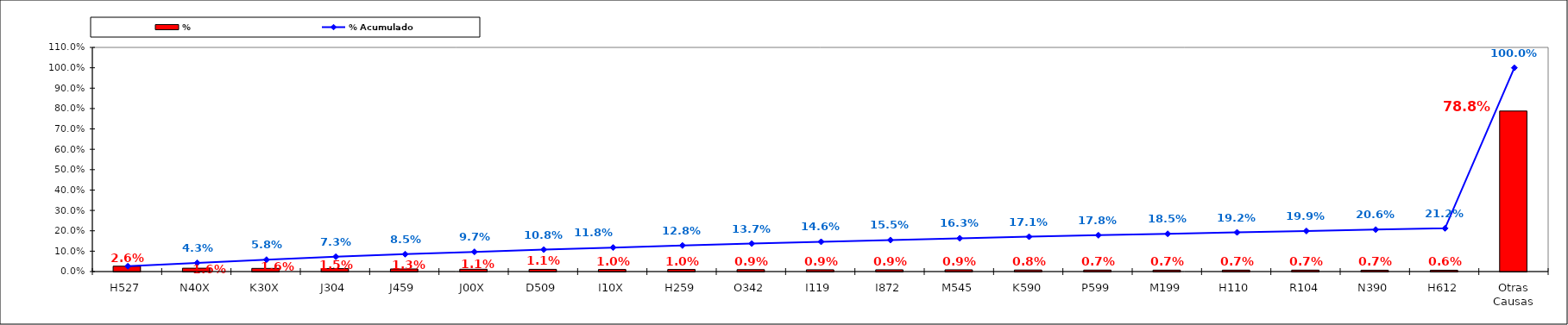
| Category | % |
|---|---|
| H527 | 0.026 |
| N40X | 0.016 |
| K30X | 0.016 |
| J304 | 0.015 |
| J459 | 0.013 |
| J00X | 0.011 |
| D509 | 0.011 |
| I10X | 0.01 |
| H259 | 0.01 |
| O342 | 0.009 |
| I119 | 0.009 |
| I872 | 0.009 |
| M545 | 0.009 |
| K590 | 0.008 |
| P599 | 0.007 |
| M199 | 0.007 |
| H110 | 0.007 |
| R104 | 0.007 |
| N390 | 0.007 |
| H612 | 0.006 |
| Otras Causas | 0.788 |